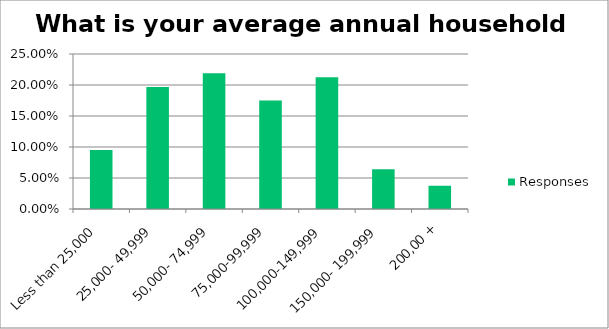
| Category | Responses |
|---|---|
| Less than 25,000 | 0.095 |
| 25,000- 49,999 | 0.197 |
| 50,000- 74,999 | 0.219 |
| 75,000-99,999 | 0.175 |
| 100,000-149,999 | 0.212 |
| 150,000- 199,999 | 0.064 |
| 200,00 + | 0.038 |